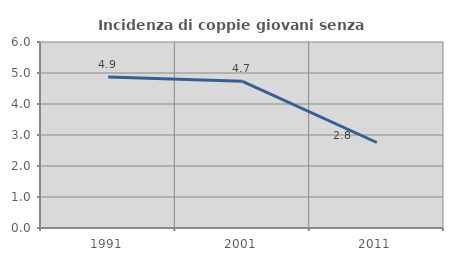
| Category | Incidenza di coppie giovani senza figli |
|---|---|
| 1991.0 | 4.867 |
| 2001.0 | 4.73 |
| 2011.0 | 2.758 |